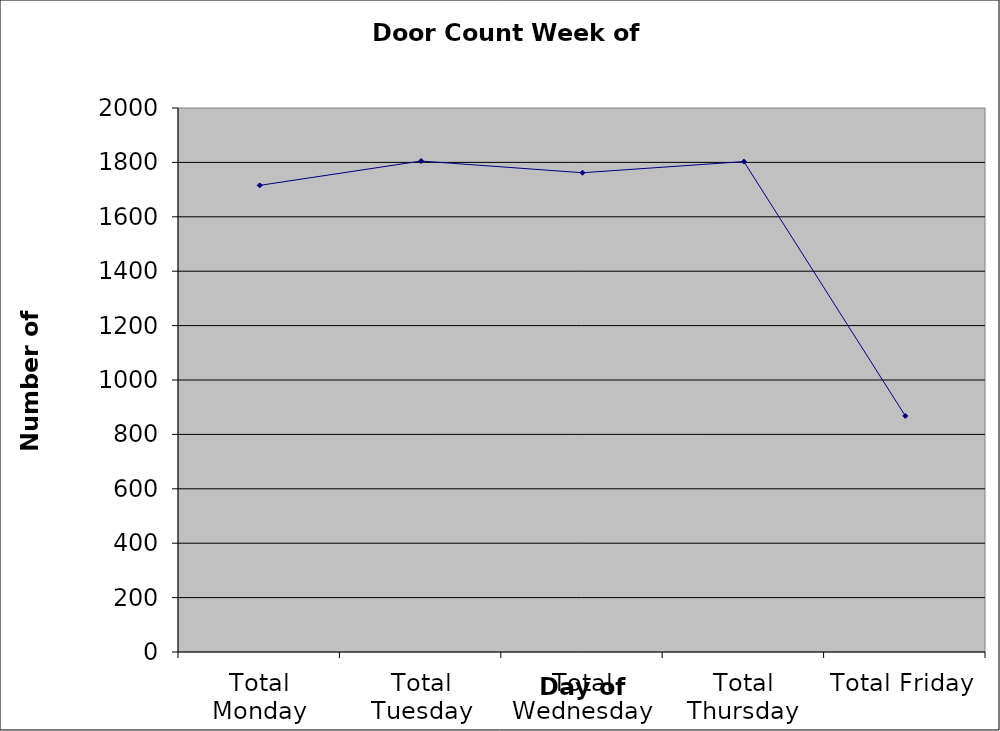
| Category | Series 0 |
|---|---|
| Total Monday | 1715.5 |
| Total Tuesday | 1805 |
| Total Wednesday | 1762 |
| Total Thursday | 1803 |
| Total Friday | 868 |